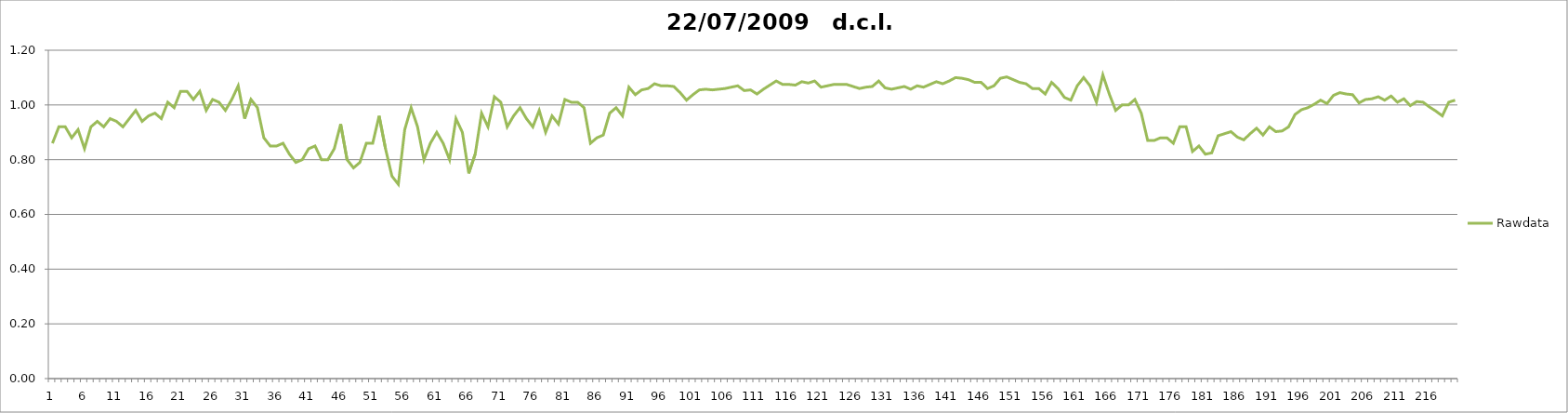
| Category | Rawdata |
|---|---|
| 0 | 0.86 |
| 1 | 0.92 |
| 2 | 0.92 |
| 3 | 0.88 |
| 4 | 0.91 |
| 5 | 0.84 |
| 6 | 0.92 |
| 7 | 0.94 |
| 8 | 0.92 |
| 9 | 0.95 |
| 10 | 0.94 |
| 11 | 0.92 |
| 12 | 0.95 |
| 13 | 0.98 |
| 14 | 0.94 |
| 15 | 0.96 |
| 16 | 0.97 |
| 17 | 0.95 |
| 18 | 1.01 |
| 19 | 0.99 |
| 20 | 1.05 |
| 21 | 1.05 |
| 22 | 1.02 |
| 23 | 1.05 |
| 24 | 0.98 |
| 25 | 1.02 |
| 26 | 1.01 |
| 27 | 0.98 |
| 28 | 1.02 |
| 29 | 1.07 |
| 30 | 0.95 |
| 31 | 1.02 |
| 32 | 0.99 |
| 33 | 0.88 |
| 34 | 0.85 |
| 35 | 0.85 |
| 36 | 0.86 |
| 37 | 0.82 |
| 38 | 0.79 |
| 39 | 0.8 |
| 40 | 0.84 |
| 41 | 0.85 |
| 42 | 0.8 |
| 43 | 0.8 |
| 44 | 0.84 |
| 45 | 0.93 |
| 46 | 0.8 |
| 47 | 0.77 |
| 48 | 0.79 |
| 49 | 0.86 |
| 50 | 0.86 |
| 51 | 0.96 |
| 52 | 0.84 |
| 53 | 0.74 |
| 54 | 0.71 |
| 55 | 0.91 |
| 56 | 0.99 |
| 57 | 0.92 |
| 58 | 0.8 |
| 59 | 0.86 |
| 60 | 0.9 |
| 61 | 0.86 |
| 62 | 0.8 |
| 63 | 0.95 |
| 64 | 0.9 |
| 65 | 0.75 |
| 66 | 0.82 |
| 67 | 0.97 |
| 68 | 0.92 |
| 69 | 1.03 |
| 70 | 1.01 |
| 71 | 0.92 |
| 72 | 0.96 |
| 73 | 0.99 |
| 74 | 0.95 |
| 75 | 0.92 |
| 76 | 0.98 |
| 77 | 0.9 |
| 78 | 0.96 |
| 79 | 0.93 |
| 80 | 1.02 |
| 81 | 1.01 |
| 82 | 1.01 |
| 83 | 0.99 |
| 84 | 0.86 |
| 85 | 0.88 |
| 86 | 0.89 |
| 87 | 0.97 |
| 88 | 0.99 |
| 89 | 0.96 |
| 90 | 1.065 |
| 91 | 1.037 |
| 92 | 1.055 |
| 93 | 1.06 |
| 94 | 1.078 |
| 95 | 1.07 |
| 96 | 1.07 |
| 97 | 1.068 |
| 98 | 1.045 |
| 99 | 1.017 |
| 100 | 1.037 |
| 101 | 1.055 |
| 102 | 1.057 |
| 103 | 1.055 |
| 104 | 1.057 |
| 105 | 1.06 |
| 106 | 1.065 |
| 107 | 1.07 |
| 108 | 1.052 |
| 109 | 1.055 |
| 110 | 1.04 |
| 111 | 1.057 |
| 112 | 1.072 |
| 113 | 1.088 |
| 114 | 1.075 |
| 115 | 1.075 |
| 116 | 1.072 |
| 117 | 1.085 |
| 118 | 1.08 |
| 119 | 1.088 |
| 120 | 1.065 |
| 121 | 1.07 |
| 122 | 1.075 |
| 123 | 1.075 |
| 124 | 1.075 |
| 125 | 1.068 |
| 126 | 1.06 |
| 127 | 1.065 |
| 128 | 1.068 |
| 129 | 1.088 |
| 130 | 1.062 |
| 131 | 1.057 |
| 132 | 1.062 |
| 133 | 1.068 |
| 134 | 1.057 |
| 135 | 1.07 |
| 136 | 1.065 |
| 137 | 1.075 |
| 138 | 1.085 |
| 139 | 1.078 |
| 140 | 1.088 |
| 141 | 1.1 |
| 142 | 1.098 |
| 143 | 1.092 |
| 144 | 1.082 |
| 145 | 1.082 |
| 146 | 1.06 |
| 147 | 1.07 |
| 148 | 1.097 |
| 149 | 1.102 |
| 150 | 1.092 |
| 151 | 1.082 |
| 152 | 1.078 |
| 153 | 1.06 |
| 154 | 1.06 |
| 155 | 1.04 |
| 156 | 1.082 |
| 157 | 1.06 |
| 158 | 1.027 |
| 159 | 1.017 |
| 160 | 1.07 |
| 161 | 1.1 |
| 162 | 1.07 |
| 163 | 1.01 |
| 164 | 1.11 |
| 165 | 1.04 |
| 166 | 0.98 |
| 167 | 1 |
| 168 | 1 |
| 169 | 1.02 |
| 170 | 0.97 |
| 171 | 0.87 |
| 172 | 0.87 |
| 173 | 0.88 |
| 174 | 0.88 |
| 175 | 0.86 |
| 176 | 0.92 |
| 177 | 0.92 |
| 178 | 0.83 |
| 179 | 0.85 |
| 180 | 0.82 |
| 181 | 0.825 |
| 182 | 0.888 |
| 183 | 0.895 |
| 184 | 0.903 |
| 185 | 0.883 |
| 186 | 0.872 |
| 187 | 0.895 |
| 188 | 0.915 |
| 189 | 0.89 |
| 190 | 0.92 |
| 191 | 0.903 |
| 192 | 0.905 |
| 193 | 0.92 |
| 194 | 0.965 |
| 195 | 0.982 |
| 196 | 0.99 |
| 197 | 1.002 |
| 198 | 1.017 |
| 199 | 1.005 |
| 200 | 1.035 |
| 201 | 1.045 |
| 202 | 1.04 |
| 203 | 1.037 |
| 204 | 1.007 |
| 205 | 1.02 |
| 206 | 1.022 |
| 207 | 1.03 |
| 208 | 1.017 |
| 209 | 1.032 |
| 210 | 1.01 |
| 211 | 1.022 |
| 212 | 0.998 |
| 213 | 1.012 |
| 214 | 1.01 |
| 215 | 0.992 |
| 216 | 0.977 |
| 217 | 0.96 |
| 218 | 1.01 |
| 219 | 1.017 |